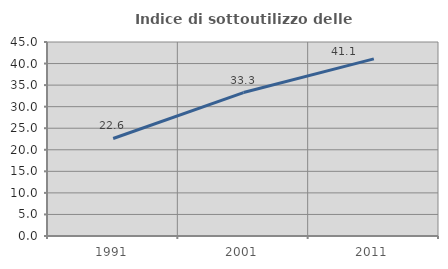
| Category | Indice di sottoutilizzo delle abitazioni  |
|---|---|
| 1991.0 | 22.619 |
| 2001.0 | 33.275 |
| 2011.0 | 41.077 |